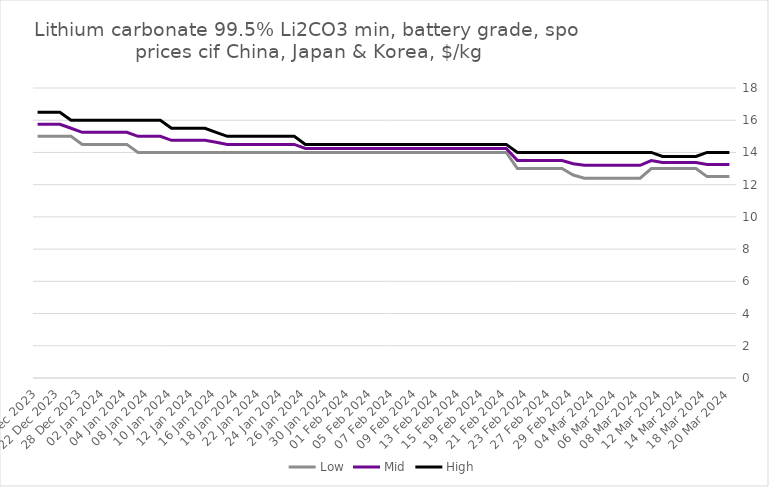
| Category | Low | Mid | High |
|---|---|---|---|
| 20 Mar 2024 | 12.5 | 13.25 | 14 |
| 19 Mar 2024 | 12.5 | 13.25 | 14 |
| 18 Mar 2024 | 12.5 | 13.25 | 14 |
| 15 Mar 2024 | 13 | 13.38 | 13.75 |
| 14 Mar 2024 | 13 | 13.38 | 13.75 |
| 13 Mar 2024 | 13 | 13.38 | 13.75 |
| 12 Mar 2024 | 13 | 13.38 | 13.75 |
| 11 Mar 2024 | 13 | 13.5 | 14 |
| 08 Mar 2024 | 12.4 | 13.2 | 14 |
| 07 Mar 2024 | 12.4 | 13.2 | 14 |
| 06 Mar 2024 | 12.4 | 13.2 | 14 |
| 05 Mar 2024 | 12.4 | 13.2 | 14 |
| 04 Mar 2024 | 12.4 | 13.2 | 14 |
| 01 Mar 2024 | 12.4 | 13.2 | 14 |
| 29 Feb 2024 | 12.6 | 13.3 | 14 |
| 28 Feb 2024 | 13 | 13.5 | 14 |
| 27 Feb 2024 | 13 | 13.5 | 14 |
| 26 Feb 2024 | 13 | 13.5 | 14 |
| 23 Feb 2024 | 13 | 13.5 | 14 |
| 22 Feb 2024 | 13 | 13.5 | 14 |
| 21 Feb 2024 | 14 | 14.25 | 14.5 |
| 20 Feb 2024 | 14 | 14.25 | 14.5 |
| 19 Feb 2024 | 14 | 14.25 | 14.5 |
| 16 Feb 2024 | 14 | 14.25 | 14.5 |
| 15 Feb 2024 | 14 | 14.25 | 14.5 |
| 14 Feb 2024 | 14 | 14.25 | 14.5 |
| 13 Feb 2024 | 14 | 14.25 | 14.5 |
| 12 Feb 2024 | 14 | 14.25 | 14.5 |
| 09 Feb 2024 | 14 | 14.25 | 14.5 |
| 08 Feb 2024 | 14 | 14.25 | 14.5 |
| 07 Feb 2024 | 14 | 14.25 | 14.5 |
| 06 Feb 2024 | 14 | 14.25 | 14.5 |
| 05 Feb 2024 | 14 | 14.25 | 14.5 |
| 02 Feb 2024 | 14 | 14.25 | 14.5 |
| 01 Feb 2024 | 14 | 14.25 | 14.5 |
| 31 Jan 2024 | 14 | 14.25 | 14.5 |
| 30 Jan 2024 | 14 | 14.25 | 14.5 |
| 29 Jan 2024 | 14 | 14.25 | 14.5 |
| 26 Jan 2024 | 14 | 14.25 | 14.5 |
| 25 Jan 2024 | 14 | 14.5 | 15 |
| 24 Jan 2024 | 14 | 14.5 | 15 |
| 23 Jan 2024 | 14 | 14.5 | 15 |
| 22 Jan 2024 | 14 | 14.5 | 15 |
| 19 Jan 2024 | 14 | 14.5 | 15 |
| 18 Jan 2024 | 14 | 14.5 | 15 |
| 17 Jan 2024 | 14 | 14.5 | 15 |
| 16 Jan 2024 | 14 | 14.63 | 15.25 |
| 15 Jan 2024 | 14 | 14.75 | 15.5 |
| 12 Jan 2024 | 14 | 14.75 | 15.5 |
| 11 Jan 2024 | 14 | 14.75 | 15.5 |
| 10 Jan 2024 | 14 | 14.75 | 15.5 |
| 09 Jan 2024 | 14 | 15 | 16 |
| 08 Jan 2024 | 14 | 15 | 16 |
| 05 Jan 2024 | 14 | 15 | 16 |
| 04 Jan 2024 | 14.5 | 15.25 | 16 |
| 03 Jan 2024 | 14.5 | 15.25 | 16 |
| 02 Jan 2024 | 14.5 | 15.25 | 16 |
| 29 Dec 2023 | 14.5 | 15.25 | 16 |
| 28 Dec 2023 | 14.5 | 15.25 | 16 |
| 27 Dec 2023 | 15 | 15.5 | 16 |
| 22 Dec 2023 | 15 | 15.75 | 16.5 |
| 21 Dec 2023 | 15 | 15.75 | 16.5 |
| 20 Dec 2023 | 15 | 15.75 | 16.5 |